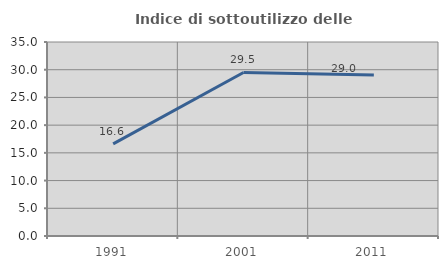
| Category | Indice di sottoutilizzo delle abitazioni  |
|---|---|
| 1991.0 | 16.62 |
| 2001.0 | 29.499 |
| 2011.0 | 29.042 |